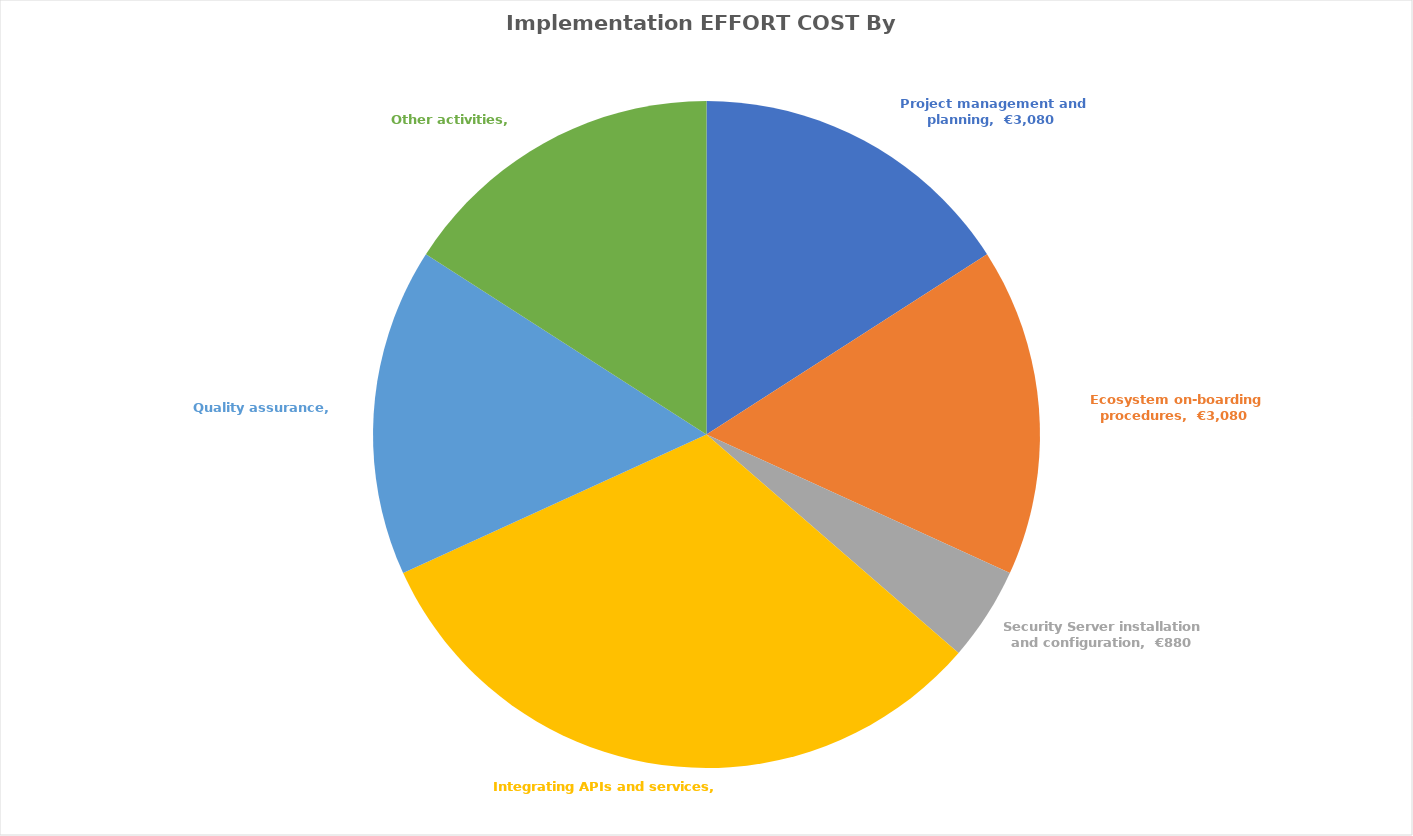
| Category | Series 0 | Series 1 |
|---|---|---|
| Project management and planning | 3080 |  |
| Ecosystem on-boarding procedures | 3080 |  |
| Security Server installation and configuration | 880 |  |
| Integrating APIs and services | 6160 |  |
| Quality assurance | 3080 |  |
| Other activities | 3080 |  |